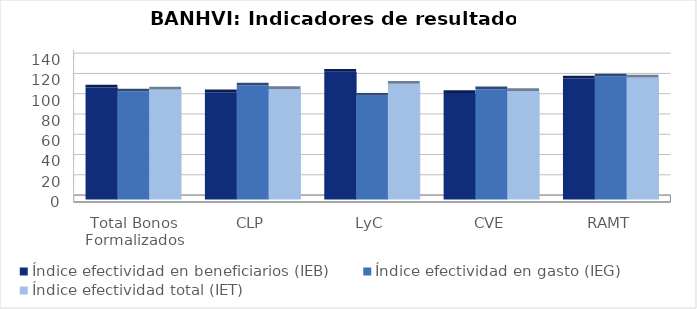
| Category | Índice efectividad en beneficiarios (IEB) | Índice efectividad en gasto (IEG)  | Índice efectividad total (IET) |
|---|---|---|---|
| Total Bonos Formalizados | 110.356 | 106.322 | 108.339 |
| CLP | 105.596 | 112.342 | 108.969 |
| LyC | 125.91 | 102.27 | 114.09 |
| CVE | 104.976 | 108.628 | 106.802 |
| RAMT | 119.164 | 121.246 | 120.205 |